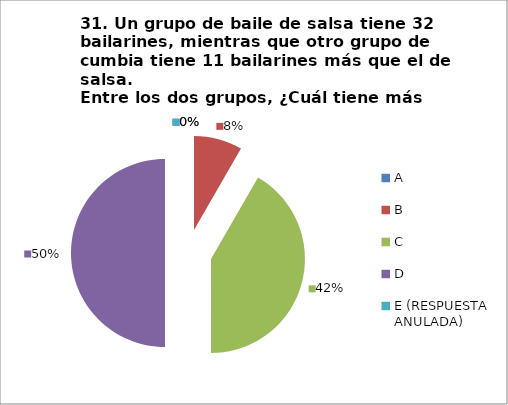
| Category | CANTIDAD DE RESPUESTAS PREGUNTA (31) | PORCENTAJE |
|---|---|---|
| A | 0 | 0 |
| B | 3 | 0.083 |
| C | 15 | 0.417 |
| D | 18 | 0.5 |
| E (RESPUESTA ANULADA) | 0 | 0 |